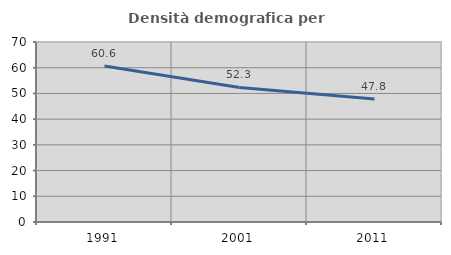
| Category | Densità demografica |
|---|---|
| 1991.0 | 60.631 |
| 2001.0 | 52.342 |
| 2011.0 | 47.841 |